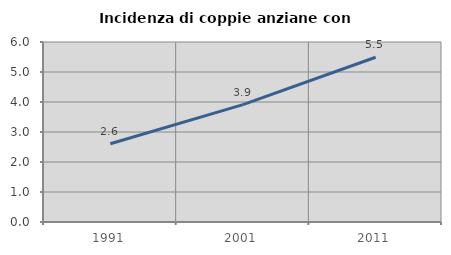
| Category | Incidenza di coppie anziane con figli |
|---|---|
| 1991.0 | 2.61 |
| 2001.0 | 3.913 |
| 2011.0 | 5.491 |